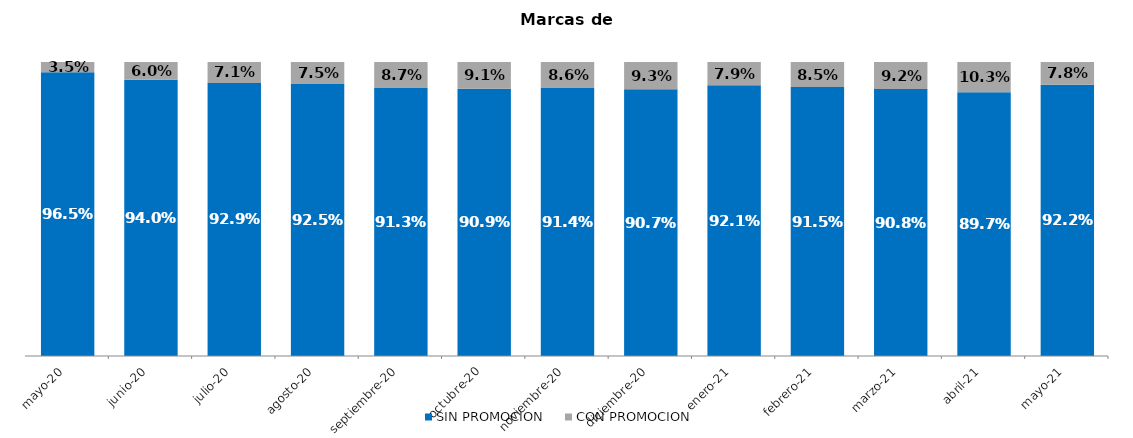
| Category | SIN PROMOCION   | CON PROMOCION   |
|---|---|---|
| 2020-05-01 | 0.965 | 0.035 |
| 2020-06-01 | 0.94 | 0.06 |
| 2020-07-01 | 0.929 | 0.071 |
| 2020-08-01 | 0.925 | 0.075 |
| 2020-09-01 | 0.913 | 0.087 |
| 2020-10-01 | 0.909 | 0.091 |
| 2020-11-01 | 0.914 | 0.086 |
| 2020-12-01 | 0.907 | 0.093 |
| 2021-01-01 | 0.921 | 0.079 |
| 2021-02-01 | 0.915 | 0.085 |
| 2021-03-01 | 0.908 | 0.092 |
| 2021-04-01 | 0.897 | 0.103 |
| 2021-05-01 | 0.922 | 0.078 |